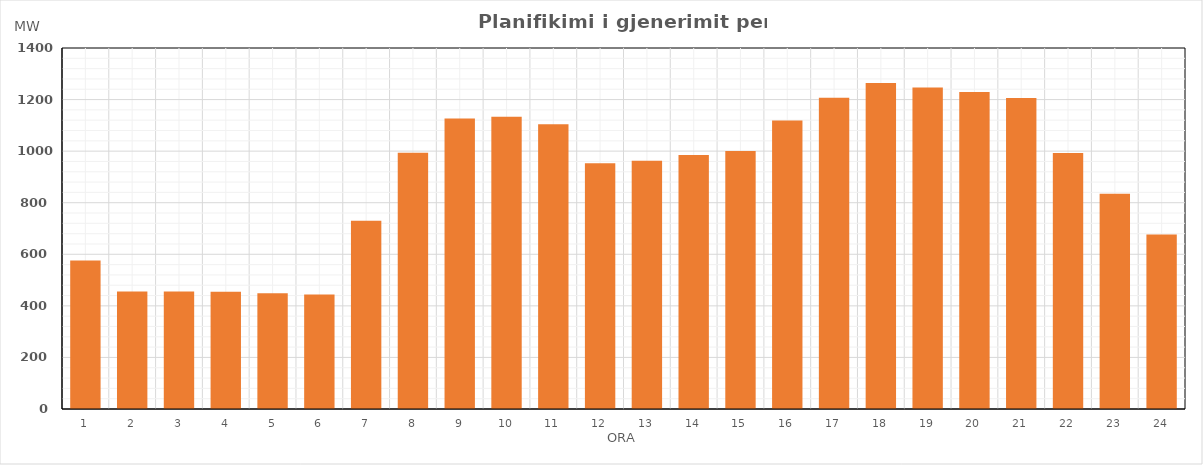
| Category | Max (MW) |
|---|---|
| 0 | 576.1 |
| 1 | 456.01 |
| 2 | 455.59 |
| 3 | 454.49 |
| 4 | 448.69 |
| 5 | 443.68 |
| 6 | 730.51 |
| 7 | 993.75 |
| 8 | 1126.95 |
| 9 | 1133.12 |
| 10 | 1104.01 |
| 11 | 953.2 |
| 12 | 962.26 |
| 13 | 985.1 |
| 14 | 1000.34 |
| 15 | 1118.74 |
| 16 | 1207.51 |
| 17 | 1264.01 |
| 18 | 1246.97 |
| 19 | 1229.77 |
| 20 | 1206.04 |
| 21 | 992.89 |
| 22 | 834.88 |
| 23 | 676.91 |